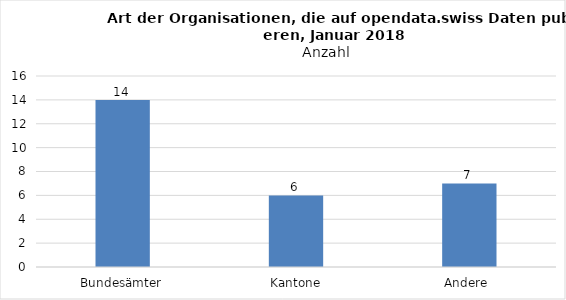
| Category | Series 0 |
|---|---|
| Bundesämter | 14 |
| Kantone | 6 |
| Andere  | 7 |